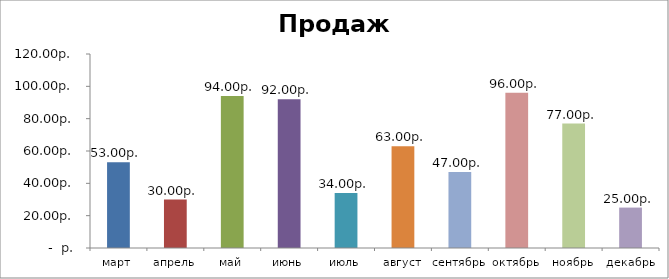
| Category | Продажи |
|---|---|
| март | 53 |
| апрель | 30 |
| май | 94 |
| июнь | 92 |
| июль | 34 |
| август | 63 |
| сентябрь | 47 |
| октябрь | 96 |
| ноябрь | 77 |
| декабрь | 25 |